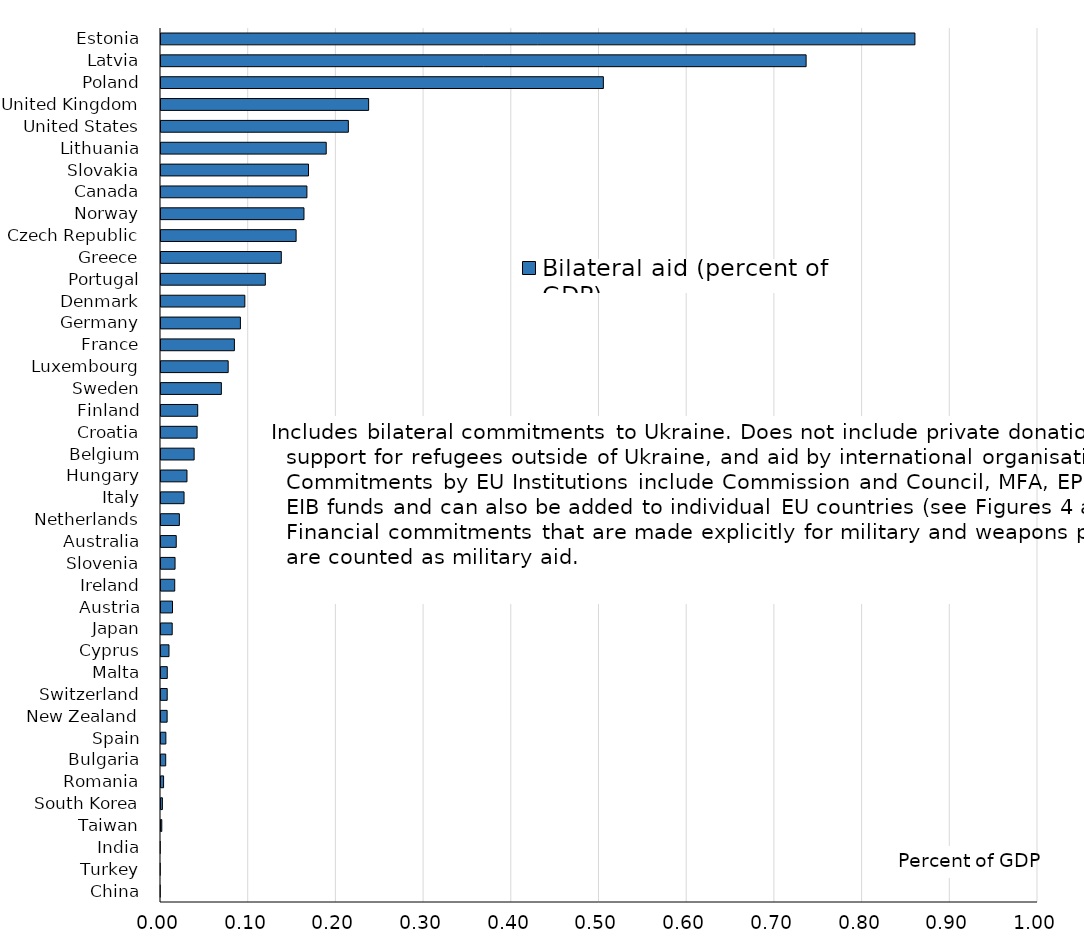
| Category | Bilateral aid (percent of GDP) |
|---|---|
| Estonia | 0.861 |
| Latvia | 0.737 |
| Poland | 0.506 |
| United Kingdom | 0.238 |
| United States | 0.215 |
| Lithuania | 0.19 |
| Slovakia | 0.169 |
| Canada | 0.168 |
| Norway | 0.164 |
| Czech Republic | 0.155 |
| Greece | 0.138 |
| Portugal | 0.12 |
| Denmark | 0.097 |
| Germany | 0.092 |
| France | 0.085 |
| Luxembourg | 0.078 |
| Sweden | 0.07 |
| Finland | 0.043 |
| Croatia | 0.042 |
| Belgium | 0.039 |
| Hungary | 0.031 |
| Italy | 0.027 |
| Netherlands | 0.022 |
| Australia | 0.019 |
| Slovenia | 0.017 |
| Ireland | 0.017 |
| Austria | 0.014 |
| Japan | 0.014 |
| Cyprus | 0.01 |
| Malta | 0.008 |
| Switzerland | 0.008 |
| New Zealand | 0.008 |
| Spain | 0.007 |
| Bulgaria | 0.007 |
| Romania | 0.004 |
| South Korea | 0.003 |
| Taiwan | 0.002 |
| India | 0 |
| Turkey | 0 |
| China | 0 |